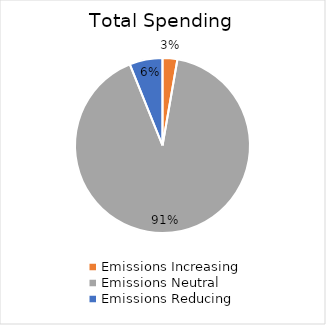
| Category | Series 0 |
|---|---|
| Emissions Increasing | 386386669528.162 |
| Emissions Neutral | 12891709764477.576 |
| Emissions Reducing | 862088781235.14 |